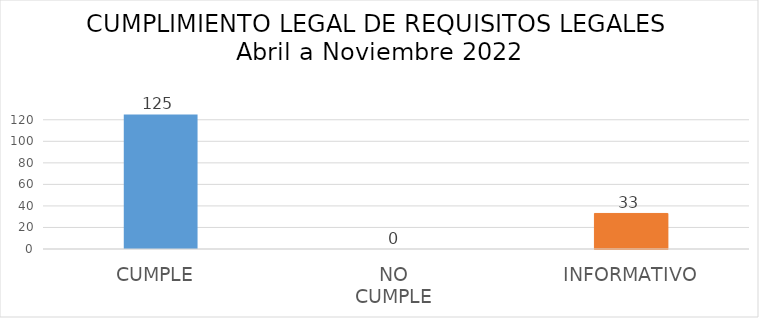
| Category | Series 0 |
|---|---|
| CUMPLE  | 125 |
| NO 
CUMPLE  | 0 |
|  INFORMATIVO  | 33 |